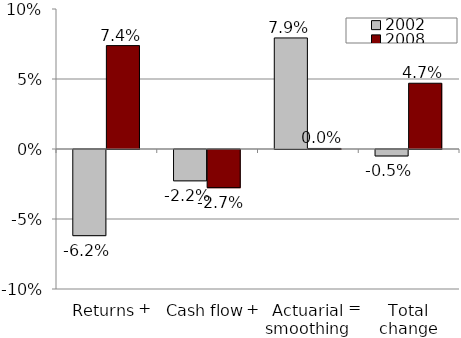
| Category | 2002 | 2008 |
|---|---|---|
| Returns | -0.062 | 0.074 |
| Cash flow | -0.022 | -0.027 |
| Actuarial smoothing | 0.079 | 0 |
| Total change | -0.005 | 0.047 |